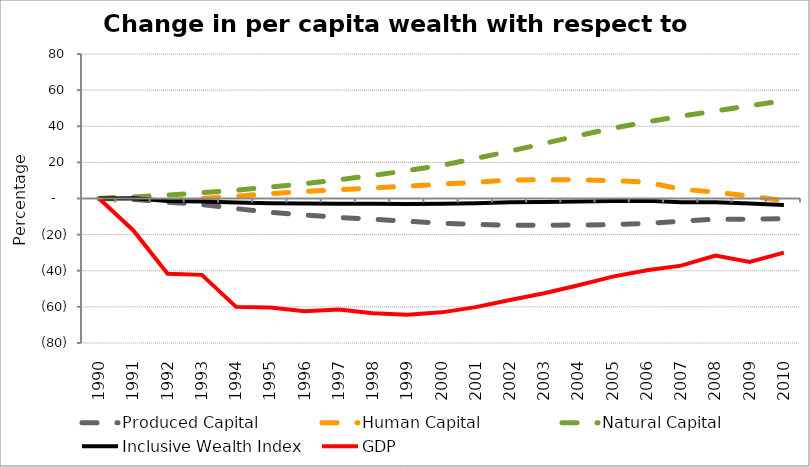
| Category | Produced Capital  | Human Capital | Natural Capital | Inclusive Wealth Index | GDP |
|---|---|---|---|---|---|
| 1990.0 | 0 | 0 | 0 | 0 | 0 |
| 1991.0 | -0.458 | 0.81 | 0.877 | 0.142 | -17.696 |
| 1992.0 | -1.97 | -1.196 | 1.927 | -1.441 | -41.653 |
| 1993.0 | -3.378 | 0.004 | 3.168 | -1.619 | -42.275 |
| 1994.0 | -5.592 | 1.313 | 4.622 | -2.166 | -60.001 |
| 1995.0 | -7.664 | 2.673 | 6.305 | -2.605 | -60.348 |
| 1996.0 | -9.153 | 3.885 | 8.225 | -2.785 | -62.41 |
| 1997.0 | -10.487 | 4.917 | 10.385 | -2.946 | -61.439 |
| 1998.0 | -11.457 | 5.857 | 12.793 | -2.939 | -63.559 |
| 1999.0 | -12.605 | 6.845 | 15.452 | -2.993 | -64.329 |
| 2000.0 | -13.675 | 7.964 | 18.359 | -2.938 | -63.042 |
| 2001.0 | -14.341 | 9.009 | 22.148 | -2.654 | -60.126 |
| 2002.0 | -14.757 | 10.25 | 26.218 | -2.14 | -56.239 |
| 2003.0 | -14.797 | 10.373 | 30.472 | -1.885 | -52.473 |
| 2004.0 | -14.706 | 10.325 | 34.749 | -1.632 | -48.06 |
| 2005.0 | -14.423 | 9.923 | 38.906 | -1.431 | -43.26 |
| 2006.0 | -13.786 | 8.99 | 42.33 | -1.304 | -39.714 |
| 2007.0 | -12.558 | 5.194 | 45.514 | -2.073 | -37.172 |
| 2008.0 | -11.396 | 3.495 | 48.49 | -2.012 | -31.568 |
| 2009.0 | -11.516 | 1.322 | 51.346 | -2.834 | -35.091 |
| 2010.0 | -11.196 | -1.263 | 54.157 | -3.597 | -30 |